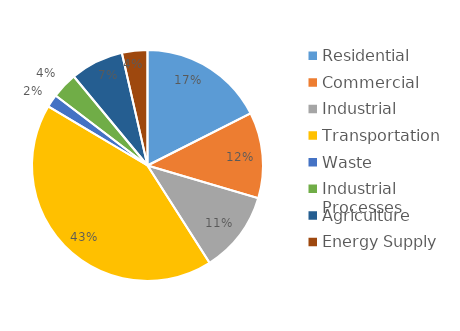
| Category | Series 0 |
|---|---|
| Residential | 1739249.395 |
| Commercial | 1189608.497 |
| Industrial | 1129661.434 |
| Transportation | 4218611.627 |
| Waste | 179858.6 |
| Industrial Processes | 360709.905 |
| Agriculture | 736914.495 |
| Energy Supply | 353098.272 |